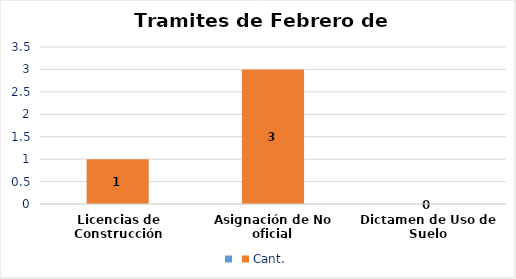
| Category | Series 0 | Cant. |
|---|---|---|
| Licencias de Construcción |  | 1 |
| Asignación de No oficial |  | 3 |
| Dictamen de Uso de Suelo |  | 0 |